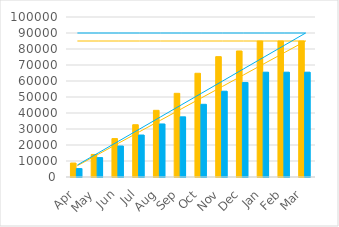
| Category | Series 0 | Series 1 |
|---|---|---|
| Apr | 8725 | 5268 |
| May | 14100 | 12131 |
| Jun | 24007 | 19381 |
| Jul | 32670 | 26235 |
| Aug | 41671 | 33154 |
| Sep | 52295 | 37603 |
| Oct | 64826 | 45436 |
| Nov | 75224 | 53621 |
| Dec | 78768 | 59085 |
| Jan | 84988 | 65512 |
| Feb | 84988 | 65512 |
| Mar | 84988 | 65512 |